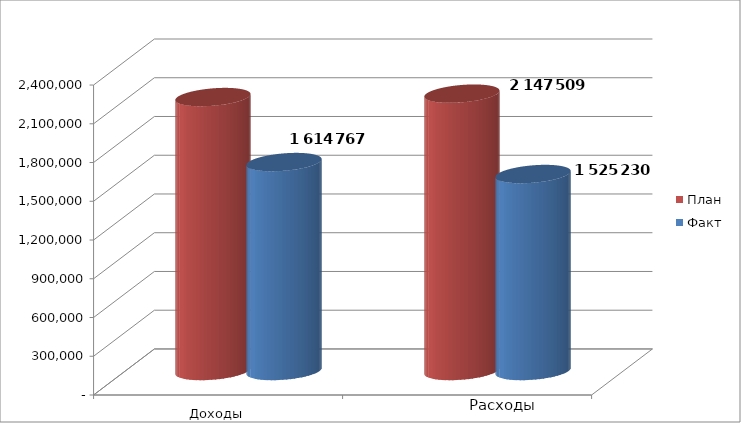
| Category | План | Факт |
|---|---|---|
| 0 | 2121104 | 1617767 |
| 1 | 2147509 | 1525229.59 |